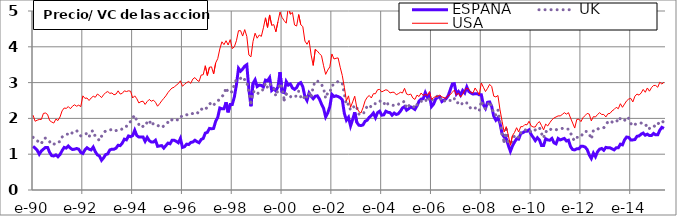
| Category | ESPAÑA | UK | USA |
|---|---|---|---|
| 1990-01-02 | 1.22 | 1.47 | 2.09 |
| 1990-02-02 | 1.17 | 1.43 | 1.92 |
| 1990-03-02 | 1.11 | 1.37 | 1.95 |
| 1990-04-02 | 1 | 1.35 | 1.97 |
| 1990-05-02 | 1.09 | 1.29 | 1.97 |
| 1990-06-02 | 1.14 | 1.43 | 2.14 |
| 1990-07-02 | 1.19 | 1.45 | 2.15 |
| 1990-08-02 | 1.19 | 1.42 | 2.11 |
| 1990-09-02 | 1.05 | 1.35 | 1.94 |
| 1990-10-02 | 0.96 | 1.27 | 1.9 |
| 1990-11-02 | 0.95 | 1.27 | 1.87 |
| 1990-12-02 | 0.98 | 1.34 | 1.98 |
| 1991-01-02 | 0.93 | 1.34 | 1.94 |
| 1991-02-02 | 0.99 | 1.35 | 2.04 |
| 1991-03-02 | 1.1 | 1.48 | 2.21 |
| 1991-04-02 | 1.19 | 1.53 | 2.29 |
| 1991-05-02 | 1.17 | 1.56 | 2.28 |
| 1991-06-02 | 1.23 | 1.56 | 2.33 |
| 1991-07-02 | 1.17 | 1.53 | 2.27 |
| 1991-08-02 | 1.13 | 1.61 | 2.34 |
| 1991-09-02 | 1.14 | 1.65 | 2.38 |
| 1991-10-02 | 1.16 | 1.66 | 2.34 |
| 1991-11-02 | 1.14 | 1.59 | 2.37 |
| 1991-12-02 | 1.05 | 1.51 | 2.33 |
| 1992-01-02 | 1.02 | 1.54 | 2.63 |
| 1992-02-02 | 1.12 | 1.56 | 2.56 |
| 1992-03-02 | 1.18 | 1.58 | 2.57 |
| 1992-04-02 | 1.14 | 1.48 | 2.5 |
| 1992-05-02 | 1.12 | 1.63 | 2.57 |
| 1992-06-02 | 1.2 | 1.66 | 2.62 |
| 1992-07-02 | 1.07 | 1.49 | 2.59 |
| 1992-08-02 | 0.98 | 1.45 | 2.68 |
| 1992-09-02 | 0.95 | 1.38 | 2.64 |
| 1992-10-02 | 0.83 | 1.5 | 2.58 |
| 1992-11-02 | 0.9 | 1.6 | 2.66 |
| 1992-12-02 | 0.99 | 1.65 | 2.72 |
| 1993-01-02 | 1.01 | 1.67 | 2.75 |
| 1993-02-02 | 1.12 | 1.67 | 2.7 |
| 1993-03-02 | 1.14 | 1.7 | 2.71 |
| 1993-04-02 | 1.14 | 1.7 | 2.66 |
| 1993-05-02 | 1.17 | 1.66 | 2.68 |
| 1993-06-02 | 1.25 | 1.68 | 2.77 |
| 1993-07-02 | 1.24 | 1.67 | 2.68 |
| 1993-08-02 | 1.31 | 1.71 | 2.7 |
| 1993-09-02 | 1.42 | 1.78 | 2.77 |
| 1993-10-02 | 1.4 | 1.78 | 2.75 |
| 1993-11-02 | 1.51 | 1.87 | 2.77 |
| 1993-12-02 | 1.49 | 1.91 | 2.76 |
| 1994-01-02 | 1.52 | 2.01 | 2.57 |
| 1994-02-02 | 1.67 | 2.09 | 2.63 |
| 1994-03-02 | 1.52 | 1.93 | 2.55 |
| 1994-04-02 | 1.48 | 1.83 | 2.43 |
| 1994-05-02 | 1.48 | 1.86 | 2.47 |
| 1994-06-02 | 1.48 | 1.77 | 2.48 |
| 1994-07-02 | 1.36 | 1.78 | 2.39 |
| 1994-08-02 | 1.47 | 1.9 | 2.47 |
| 1994-09-02 | 1.38 | 1.95 | 2.53 |
| 1994-10-02 | 1.34 | 1.8 | 2.48 |
| 1994-11-02 | 1.34 | 1.86 | 2.51 |
| 1994-12-02 | 1.39 | 1.82 | 2.45 |
| 1995-01-02 | 1.22 | 1.81 | 2.34 |
| 1995-02-02 | 1.23 | 1.77 | 2.41 |
| 1995-03-02 | 1.24 | 1.74 | 2.49 |
| 1995-04-02 | 1.17 | 1.79 | 2.56 |
| 1995-05-02 | 1.24 | 1.85 | 2.63 |
| 1995-06-02 | 1.31 | 1.89 | 2.72 |
| 1995-07-02 | 1.29 | 1.87 | 2.79 |
| 1995-08-02 | 1.39 | 1.97 | 2.85 |
| 1995-09-02 | 1.39 | 1.99 | 2.87 |
| 1995-10-02 | 1.36 | 1.97 | 2.93 |
| 1995-11-02 | 1.32 | 1.95 | 2.97 |
| 1995-12-02 | 1.44 | 2.04 | 3.05 |
| 1996-01-02 | 1.19 | 2.07 | 2.9 |
| 1996-02-02 | 1.21 | 2.11 | 2.95 |
| 1996-03-02 | 1.28 | 2.1 | 3 |
| 1996-04-02 | 1.27 | 2.12 | 3.03 |
| 1996-05-02 | 1.33 | 2.15 | 2.98 |
| 1996-06-02 | 1.34 | 2.13 | 3.1 |
| 1996-07-02 | 1.39 | 2.11 | 3.14 |
| 1996-08-02 | 1.35 | 2.13 | 3.07 |
| 1996-09-02 | 1.32 | 2.21 | 3.03 |
| 1996-10-02 | 1.41 | 2.27 | 3.21 |
| 1996-11-02 | 1.44 | 2.22 | 3.22 |
| 1996-12-02 | 1.59 | 2.27 | 3.47 |
| 1997-01-02 | 1.61 | 2.3 | 3.2 |
| 1997-02-02 | 1.72 | 2.4 | 3.43 |
| 1997-03-02 | 1.71 | 2.44 | 3.44 |
| 1997-04-02 | 1.72 | 2.37 | 3.24 |
| 1997-05-02 | 1.92 | 2.44 | 3.55 |
| 1997-06-02 | 2.03 | 2.48 | 3.67 |
| 1997-07-02 | 2.29 | 2.55 | 3.94 |
| 1997-08-02 | 2.27 | 2.61 | 4.14 |
| 1997-09-02 | 2.27 | 2.67 | 4.06 |
| 1997-10-02 | 2.45 | 2.86 | 4.17 |
| 1997-11-02 | 2.17 | 2.72 | 4.05 |
| 1997-12-02 | 2.39 | 2.72 | 4.2 |
| 1998-01-02 | 2.39 | 2.75 | 3.95 |
| 1998-02-02 | 2.6 | 2.95 | 4 |
| 1998-03-02 | 2.94 | 3.09 | 4.17 |
| 1998-04-02 | 3.4 | 3.09 | 4.45 |
| 1998-05-02 | 3.32 | 3.12 | 4.45 |
| 1998-06-02 | 3.38 | 3.04 | 4.3 |
| 1998-07-02 | 3.46 | 3.09 | 4.48 |
| 1998-08-02 | 3.5 | 3.03 | 4.29 |
| 1998-09-02 | 2.81 | 2.72 | 3.77 |
| 1998-10-02 | 2.34 | 2.44 | 3.72 |
| 1998-11-02 | 2.98 | 2.75 | 4.15 |
| 1998-12-02 | 3.08 | 2.74 | 4.38 |
| 1999-01-02 | 2.89 | 2.67 | 4.24 |
| 1999-02-02 | 2.93 | 2.75 | 4.33 |
| 1999-03-02 | 2.92 | 2.76 | 4.29 |
| 1999-04-02 | 2.88 | 2.82 | 4.53 |
| 1999-05-02 | 3.07 | 2.99 | 4.81 |
| 1999-06-02 | 3.05 | 2.86 | 4.54 |
| 1999-07-02 | 3.14 | 2.97 | 4.89 |
| 1999-08-02 | 2.78 | 2.91 | 4.6 |
| 1999-09-02 | 2.83 | 2.85 | 4.62 |
| 1999-10-02 | 2.77 | 2.62 | 4.42 |
| 1999-11-02 | 2.88 | 2.78 | 4.7 |
| 1999-12-02 | 3.29 | 2.98 | 4.97 |
| 2000-01-02 | 2.74 | 2.87 | 4.82 |
| 2000-02-02 | 2.72 | 2.52 | 4.73 |
| 2000-03-02 | 3.03 | 2.68 | 4.66 |
| 2000-04-02 | 2.93 | 2.6 | 5.12 |
| 2000-05-02 | 2.96 | 2.6 | 4.91 |
| 2000-06-02 | 2.85 | 2.65 | 4.96 |
| 2000-07-02 | 2.81 | 2.62 | 4.61 |
| 2000-08-02 | 2.86 | 2.62 | 4.58 |
| 2000-09-02 | 2.97 | 2.76 | 4.9 |
| 2000-10-02 | 3 | 2.6 | 4.62 |
| 2000-11-02 | 2.88 | 2.66 | 4.56 |
| 2000-12-02 | 2.61 | 2.52 | 4.16 |
| 2001-01-02 | 2.5 | 2.61 | 4.07 |
| 2001-02-02 | 2.71 | 2.72 | 4.18 |
| 2001-03-02 | 2.62 | 2.58 | 3.77 |
| 2001-04-02 | 2.55 | 2.89 | 3.48 |
| 2001-05-02 | 2.62 | 3.04 | 3.93 |
| 2001-06-02 | 2.63 | 3.05 | 3.88 |
| 2001-07-02 | 2.54 | 2.98 | 3.81 |
| 2001-08-02 | 2.4 | 2.95 | 3.75 |
| 2001-09-02 | 2.28 | 2.83 | 3.47 |
| 2001-10-02 | 2.04 | 2.56 | 3.23 |
| 2001-11-02 | 2.15 | 2.72 | 3.35 |
| 2001-12-02 | 2.33 | 2.72 | 3.44 |
| 2002-01-02 | 2.67 | 2.92 | 3.8 |
| 2002-02-02 | 2.61 | 2.94 | 3.66 |
| 2002-03-02 | 2.63 | 2.97 | 3.68 |
| 2002-04-02 | 2.61 | 3.04 | 3.69 |
| 2002-05-02 | 2.58 | 3.02 | 3.43 |
| 2002-06-02 | 2.52 | 2.98 | 3.2 |
| 2002-07-02 | 2.14 | 2.68 | 2.87 |
| 2002-08-02 | 1.95 | 2.36 | 2.49 |
| 2002-09-02 | 2.03 | 2.41 | 2.63 |
| 2002-10-02 | 1.79 | 2.23 | 2.31 |
| 2002-11-02 | 1.97 | 2.27 | 2.46 |
| 2002-12-02 | 2.17 | 2.37 | 2.62 |
| 2003-01-02 | 1.89 | 2.3 | 2.3 |
| 2003-02-02 | 1.81 | 2.12 | 2.19 |
| 2003-03-02 | 1.8 | 2.11 | 2.15 |
| 2003-04-02 | 1.82 | 2.11 | 2.3 |
| 2003-05-02 | 1.92 | 2.23 | 2.49 |
| 2003-06-02 | 1.95 | 2.34 | 2.59 |
| 2003-07-02 | 2.03 | 2.29 | 2.64 |
| 2003-08-02 | 2.08 | 2.35 | 2.57 |
| 2003-09-02 | 2.15 | 2.42 | 2.69 |
| 2003-10-02 | 2.02 | 2.41 | 2.69 |
| 2003-11-02 | 2.16 | 2.47 | 2.8 |
| 2003-12-02 | 2.2 | 2.49 | 2.81 |
| 2004-01-02 | 2.09 | 2.45 | 2.74 |
| 2004-02-02 | 2.1 | 2.39 | 2.77 |
| 2004-03-02 | 2.2 | 2.48 | 2.8 |
| 2004-04-02 | 2.17 | 2.4 | 2.78 |
| 2004-05-02 | 2.16 | 2.41 | 2.71 |
| 2004-06-02 | 2.09 | 2.37 | 2.73 |
| 2004-07-02 | 2.15 | 2.36 | 2.73 |
| 2004-08-02 | 2.11 | 2.35 | 2.66 |
| 2004-09-02 | 2.13 | 2.39 | 2.69 |
| 2004-10-02 | 2.2 | 2.45 | 2.73 |
| 2004-11-02 | 2.29 | 2.45 | 2.71 |
| 2004-12-02 | 2.33 | 2.48 | 2.84 |
| 2005-01-02 | 2.23 | 2.28 | 2.68 |
| 2005-02-02 | 2.27 | 2.35 | 2.66 |
| 2005-03-02 | 2.32 | 2.39 | 2.68 |
| 2005-04-02 | 2.29 | 2.36 | 2.57 |
| 2005-05-02 | 2.25 | 2.28 | 2.53 |
| 2005-06-02 | 2.35 | 2.38 | 2.65 |
| 2005-07-02 | 2.48 | 2.4 | 2.61 |
| 2005-08-02 | 2.54 | 2.48 | 2.71 |
| 2005-09-02 | 2.55 | 2.47 | 2.64 |
| 2005-10-02 | 2.72 | 2.53 | 2.67 |
| 2005-11-02 | 2.59 | 2.45 | 2.64 |
| 2005-12-02 | 2.65 | 2.57 | 2.75 |
| 2006-01-02 | 2.33 | 2.49 | 2.53 |
| 2006-02-02 | 2.4 | 2.56 | 2.58 |
| 2006-03-02 | 2.54 | 2.61 | 2.61 |
| 2006-04-02 | 2.59 | 2.62 | 2.62 |
| 2006-05-02 | 2.6 | 2.63 | 2.65 |
| 2006-06-02 | 2.47 | 2.47 | 2.6 |
| 2006-07-02 | 2.51 | 2.5 | 2.58 |
| 2006-08-02 | 2.55 | 2.47 | 2.56 |
| 2006-09-02 | 2.63 | 2.51 | 2.64 |
| 2006-10-02 | 2.79 | 2.5 | 2.66 |
| 2006-11-02 | 2.96 | 2.58 | 2.73 |
| 2006-12-02 | 2.97 | 2.55 | 2.79 |
| 2007-01-02 | 2.68 | 2.43 | 2.65 |
| 2007-02-02 | 2.75 | 2.44 | 2.71 |
| 2007-03-02 | 2.65 | 2.37 | 2.6 |
| 2007-04-02 | 2.78 | 2.43 | 2.67 |
| 2007-05-02 | 2.71 | 2.47 | 2.78 |
| 2007-06-02 | 2.88 | 2.43 | 2.85 |
| 2007-07-02 | 2.75 | 2.38 | 2.81 |
| 2007-08-02 | 2.71 | 2.26 | 2.72 |
| 2007-09-02 | 2.68 | 2.27 | 2.71 |
| 2007-10-02 | 2.69 | 2.29 | 2.85 |
| 2007-11-02 | 2.69 | 2.28 | 2.76 |
| 2007-12-02 | 2.66 | 2.21 | 2.66 |
| 2008-01-02 | 2.66 | 2.49 | 2.99 |
| 2008-02-02 | 2.38 | 2.33 | 2.87 |
| 2008-03-02 | 2.28 | 2.27 | 2.75 |
| 2008-04-02 | 2.45 | 2.37 | 2.84 |
| 2008-05-02 | 2.46 | 2.47 | 2.95 |
| 2008-06-02 | 2.33 | 2.33 | 2.89 |
| 2008-07-02 | 2.06 | 2.11 | 2.62 |
| 2008-08-02 | 1.95 | 2.1 | 2.6 |
| 2008-09-02 | 2.02 | 2.24 | 2.64 |
| 2008-10-02 | 1.86 | 1.89 | 2.24 |
| 2008-11-02 | 1.57 | 1.55 | 1.92 |
| 2008-12-02 | 1.48 | 1.36 | 1.62 |
| 2009-01-02 | 1.44 | 1.69 | 1.77 |
| 2009-02-02 | 1.25 | 1.35 | 1.53 |
| 2009-03-02 | 1.08 | 1.28 | 1.25 |
| 2009-04-02 | 1.23 | 1.39 | 1.52 |
| 2009-05-02 | 1.34 | 1.52 | 1.61 |
| 2009-06-02 | 1.43 | 1.54 | 1.74 |
| 2009-07-02 | 1.42 | 1.46 | 1.62 |
| 2009-08-02 | 1.58 | 1.6 | 1.77 |
| 2009-09-02 | 1.6 | 1.67 | 1.77 |
| 2009-10-02 | 1.64 | 1.68 | 1.83 |
| 2009-11-02 | 1.64 | 1.67 | 1.82 |
| 2009-12-02 | 1.68 | 1.69 | 1.92 |
| 2010-01-02 | 1.55 | 1.61 | 1.79 |
| 2010-02-02 | 1.47 | 1.63 | 1.76 |
| 2010-03-02 | 1.38 | 1.68 | 1.76 |
| 2010-04-02 | 1.46 | 1.74 | 1.86 |
| 2010-05-02 | 1.4 | 1.74 | 1.91 |
| 2010-06-02 | 1.24 | 1.58 | 1.8 |
| 2010-07-02 | 1.24 | 1.45 | 1.68 |
| 2010-08-02 | 1.43 | 1.64 | 1.84 |
| 2010-09-02 | 1.4 | 1.61 | 1.79 |
| 2010-10-02 | 1.39 | 1.68 | 1.88 |
| 2010-11-02 | 1.44 | 1.71 | 1.96 |
| 2010-12-02 | 1.32 | 1.7 | 2.01 |
| 2011-01-02 | 1.29 | 1.68 | 2.04 |
| 2011-02-02 | 1.44 | 1.71 | 2.07 |
| 2011-03-02 | 1.4 | 1.71 | 2.07 |
| 2011-04-02 | 1.42 | 1.72 | 2.11 |
| 2011-05-02 | 1.44 | 1.73 | 2.16 |
| 2011-06-02 | 1.37 | 1.7 | 2.12 |
| 2011-07-02 | 1.39 | 1.7 | 2.16 |
| 2011-08-02 | 1.21 | 1.6 | 2.01 |
| 2011-09-02 | 1.13 | 1.44 | 1.87 |
| 2011-10-02 | 1.12 | 1.38 | 1.73 |
| 2011-11-02 | 1.15 | 1.47 | 1.97 |
| 2011-12-02 | 1.15 | 1.47 | 1.98 |
| 2012-01-02 | 1.22 | 1.48 | 1.91 |
| 2012-02-02 | 1.22 | 1.6 | 2.02 |
| 2012-03-02 | 1.2 | 1.64 | 2.08 |
| 2012-04-02 | 1.13 | 1.63 | 2.14 |
| 2012-05-02 | 0.98 | 1.57 | 2.12 |
| 2012-06-02 | 0.88 | 1.42 | 1.93 |
| 2012-07-02 | 1.03 | 1.66 | 2.05 |
| 2012-08-02 | 0.93 | 1.65 | 2.04 |
| 2012-09-02 | 1.07 | 1.7 | 2.11 |
| 2012-10-02 | 1.14 | 1.73 | 2.16 |
| 2012-11-02 | 1.16 | 1.74 | 2.11 |
| 2012-12-02 | 1.11 | 1.74 | 2.11 |
| 2013-01-02 | 1.19 | 1.81 | 2.04 |
| 2013-02-02 | 1.18 | 1.91 | 2.13 |
| 2013-03-02 | 1.18 | 1.94 | 2.14 |
| 2013-04-02 | 1.15 | 1.9 | 2.21 |
| 2013-05-02 | 1.12 | 1.94 | 2.25 |
| 2013-06-02 | 1.18 | 1.96 | 2.31 |
| 2013-07-02 | 1.18 | 1.89 | 2.27 |
| 2013-08-02 | 1.28 | 2.01 | 2.41 |
| 2013-09-02 | 1.26 | 1.98 | 2.31 |
| 2013-10-02 | 1.4 | 1.94 | 2.4 |
| 2013-11-02 | 1.48 | 2.04 | 2.49 |
| 2013-12-02 | 1.47 | 2 | 2.54 |
| 2014-01-02 | 1.4 | 1.86 | 2.56 |
| 2014-02-02 | 1.4 | 1.79 | 2.46 |
| 2014-03-02 | 1.41 | 1.84 | 2.62 |
| 2014-04-02 | 1.5 | 1.83 | 2.68 |
| 2014-05-02 | 1.51 | 1.85 | 2.65 |
| 2014-06-02 | 1.56 | 1.87 | 2.71 |
| 2014-07-02 | 1.59 | 1.84 | 2.81 |
| 2014-08-02 | 1.53 | 1.79 | 2.73 |
| 2014-09-02 | 1.56 | 1.83 | 2.85 |
| 2014-10-02 | 1.52 | 1.72 | 2.76 |
| 2014-11-02 | 1.52 | 1.75 | 2.86 |
| 2014-12-02 | 1.58 | 1.8 | 2.92 |
| 2015-01-02 | 1.54 | 1.76 | 2.92 |
| 2015-02-02 | 1.54 | 1.84 | 2.87 |
| 2015-03-02 | 1.67 | 1.9 | 3.01 |
| 2015-04-02 | 1.75 | 1.87 | 2.96 |
| 2015-05-02 | 1.72 | 1.94 | 3.01 |